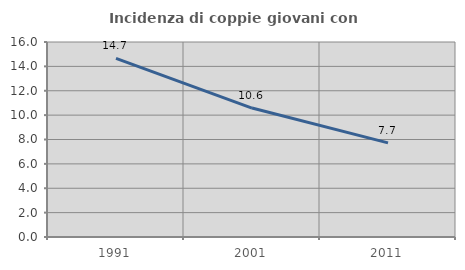
| Category | Incidenza di coppie giovani con figli |
|---|---|
| 1991.0 | 14.664 |
| 2001.0 | 10.581 |
| 2011.0 | 7.726 |